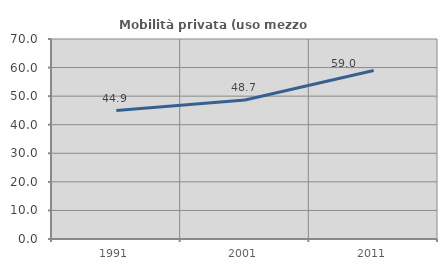
| Category | Mobilità privata (uso mezzo privato) |
|---|---|
| 1991.0 | 44.94 |
| 2001.0 | 48.659 |
| 2011.0 | 58.993 |